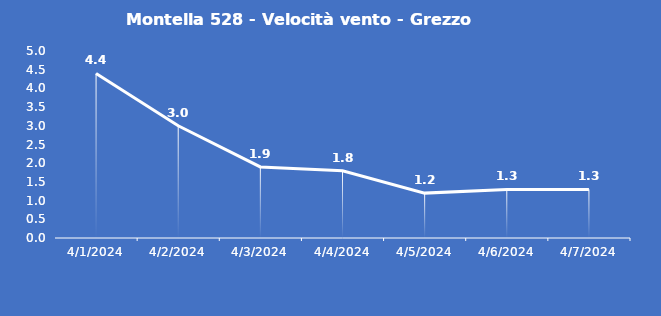
| Category | Montella 528 - Velocità vento - Grezzo (m/s) |
|---|---|
| 4/1/24 | 4.4 |
| 4/2/24 | 3 |
| 4/3/24 | 1.9 |
| 4/4/24 | 1.8 |
| 4/5/24 | 1.2 |
| 4/6/24 | 1.3 |
| 4/7/24 | 1.3 |